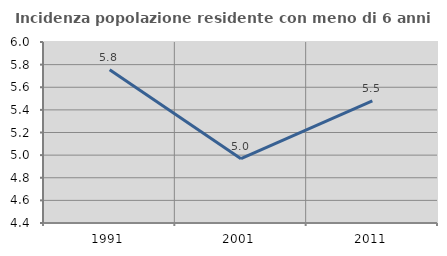
| Category | Incidenza popolazione residente con meno di 6 anni |
|---|---|
| 1991.0 | 5.755 |
| 2001.0 | 4.968 |
| 2011.0 | 5.479 |